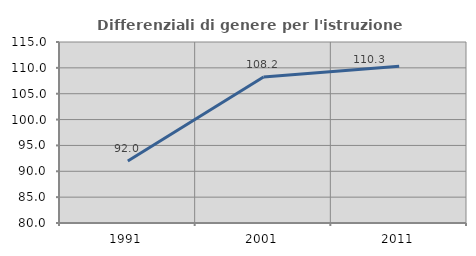
| Category | Differenziali di genere per l'istruzione superiore |
|---|---|
| 1991.0 | 91.983 |
| 2001.0 | 108.241 |
| 2011.0 | 110.296 |